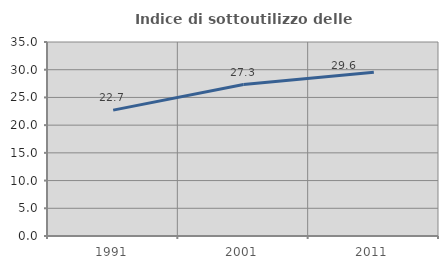
| Category | Indice di sottoutilizzo delle abitazioni  |
|---|---|
| 1991.0 | 22.711 |
| 2001.0 | 27.33 |
| 2011.0 | 29.556 |